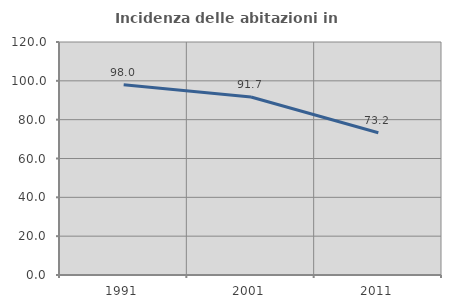
| Category | Incidenza delle abitazioni in proprietà  |
|---|---|
| 1991.0 | 97.959 |
| 2001.0 | 91.667 |
| 2011.0 | 73.239 |